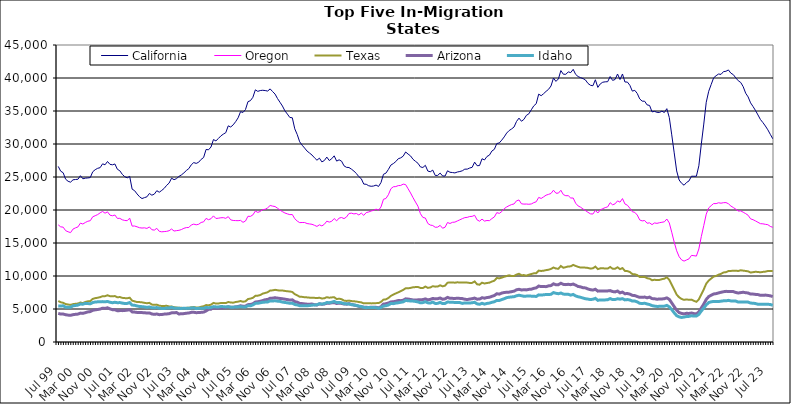
| Category |  California  |  Oregon  |  Texas  |  Arizona  |  Idaho  |
|---|---|---|---|---|---|
| Jul 99 | 26605 | 17749 | 6209 | 4339 | 5471 |
| Aug 99 | 25882 | 17447 | 6022 | 4228 | 5444 |
| Sep 99 | 25644 | 17401 | 5941 | 4237 | 5488 |
| Oct 99 | 24669 | 16875 | 5751 | 4134 | 5279 |
| Nov 99 | 24353 | 16701 | 5680 | 4073 | 5260 |
| Dec 99 | 24218 | 16570 | 5619 | 4042 | 5269 |
| Jan 00 | 24574 | 17109 | 5736 | 4142 | 5485 |
| Feb 00 | 24620 | 17295 | 5789 | 4192 | 5530 |
| Mar 00 | 24655 | 17436 | 5826 | 4226 | 5590 |
| Apr 00 | 25195 | 18009 | 5980 | 4375 | 5748 |
| May 00 | 24730 | 17875 | 5897 | 4337 | 5729 |
| Jun 00 | 24825 | 18113 | 6070 | 4444 | 5853 |
| Jul 00 | 24857 | 18294 | 6163 | 4555 | 5824 |
| Aug 00 | 24913 | 18376 | 6199 | 4603 | 5788 |
| Sep 00 | 25792 | 18971 | 6529 | 4804 | 5976 |
| Oct 00 | 26106 | 19135 | 6643 | 4870 | 6058 |
| Nov 00 | 26315 | 19306 | 6705 | 4926 | 6085 |
| Dec 00 | 26415 | 19570 | 6793 | 4991 | 6096 |
| Jan 01 | 26995 | 19781 | 6942 | 5122 | 6119 |
| Feb 01 | 26851 | 19519 | 6948 | 5089 | 6090 |
| Mar 01 | 27352 | 19720 | 7080 | 5180 | 6143 |
| Apr 01 | 26918 | 19221 | 6943 | 5020 | 6020 |
| May 01 | 26848 | 19126 | 6924 | 4899 | 5950 |
| Jun 01 | 26974 | 19241 | 6959 | 4895 | 6019 |
| Jul 01 | 26172 | 18725 | 6778 | 4737 | 5951 |
| Aug 01 | 25943 | 18736 | 6810 | 4757 | 5973 |
| Sep 01 | 25399 | 18514 | 6688 | 4753 | 5895 |
| Oct 01 | 25050 | 18415 | 6650 | 4780 | 5833 |
| Nov 01 | 24873 | 18381 | 6631 | 4826 | 5850 |
| Dec 01 | 25099 | 18765 | 6708 | 4898 | 5969 |
| Jan 02 | 23158 | 17561 | 6261 | 4560 | 5595 |
| Feb 02 | 22926 | 17573 | 6162 | 4531 | 5560 |
| Mar 02 | 22433 | 17452 | 6052 | 4481 | 5458 |
| Apr 02 | 22012 | 17314 | 6046 | 4458 | 5380 |
| May 02 | 21733 | 17267 | 6007 | 4452 | 5358 |
| Jun 02 | 21876 | 17298 | 5933 | 4444 | 5315 |
| Jul 02 | 21997 | 17209 | 5873 | 4383 | 5243 |
| Aug 02 | 22507 | 17436 | 5929 | 4407 | 5315 |
| Sep 02 | 22244 | 17010 | 5672 | 4248 | 5192 |
| Oct 02 | 22406 | 16952 | 5625 | 4191 | 5167 |
| Nov 02 | 22922 | 17223 | 5663 | 4242 | 5221 |
| Dec 02 | 22693 | 16770 | 5499 | 4142 | 5120 |
| Jan 03 | 22964 | 16694 | 5463 | 4166 | 5089 |
| Feb 03 | 23276 | 16727 | 5461 | 4226 | 5077 |
| Mar 03 | 23736 | 16766 | 5486 | 4251 | 5145 |
| Apr 03 | 24079 | 16859 | 5389 | 4289 | 5145 |
| May 03 | 24821 | 17117 | 5378 | 4415 | 5254 |
| Jun 03 | 24592 | 16812 | 5273 | 4426 | 5135 |
| Jul 03 | 24754 | 16875 | 5226 | 4466 | 5124 |
| Aug 03 | 25092 | 16922 | 5181 | 4244 | 5100 |
| Sep 03 | 25316 | 17036 | 5181 | 4279 | 5086 |
| Oct 03 | 25622 | 17228 | 5139 | 4301 | 5110 |
| Nov 03 | 25984 | 17335 | 5175 | 4362 | 5091 |
| Dec 03 | 26269 | 17350 | 5189 | 4396 | 5113 |
| Jan 04 | 26852 | 17734 | 5255 | 4492 | 5152 |
| Feb 04 | 27184 | 17860 | 5301 | 4502 | 5183 |
| Mar 04 | 27062 | 17757 | 5227 | 4443 | 5056 |
| Apr 04 | 27238 | 17840 | 5227 | 4461 | 5104 |
| May 04 | 27671 | 18113 | 5345 | 4493 | 5095 |
| Jun 04 | 27949 | 18201 | 5416 | 4532 | 5103 |
| Jul 04 | 29172 | 18727 | 5597 | 4697 | 5231 |
| Aug 04 | 29122 | 18529 | 5561 | 4945 | 5197 |
| Sep 04 | 29542 | 18678 | 5656 | 4976 | 5237 |
| Oct 04 | 30674 | 19108 | 5922 | 5188 | 5363 |
| Nov 04 | 30472 | 18716 | 5823 | 5106 | 5321 |
| Dec 04 | 30831 | 18755 | 5838 | 5135 | 5312 |
| Jan 05 | 31224 | 18823 | 5906 | 5155 | 5374 |
| Feb 05 | 31495 | 18842 | 5898 | 5168 | 5357 |
| Mar 05 | 31714 | 18738 | 5894 | 5212 | 5313 |
| Apr 05 | 32750 | 18998 | 6060 | 5340 | 5350 |
| May 05 | 32575 | 18504 | 5989 | 5269 | 5276 |
| Jun 05 | 32898 | 18414 | 5954 | 5252 | 5271 |
| Jul 05 | 33384 | 18395 | 6062 | 5322 | 5322 |
| Aug 05 | 33964 | 18381 | 6113 | 5375 | 5316 |
| Sep 05 | 34897 | 18426 | 6206 | 5493 | 5362 |
| Oct 05 | 34780 | 18132 | 6100 | 5408 | 5308 |
| Nov 05 | 35223 | 18332 | 6162 | 5434 | 5314 |
| Dec 05 | 36415 | 19047 | 6508 | 5658 | 5487 |
| Jan 06 | 36567 | 19032 | 6576 | 5688 | 5480 |
| Feb 06 | 37074 | 19257 | 6692 | 5792 | 5616 |
| Mar 06 | 38207 | 19845 | 6993 | 6052 | 5850 |
| Apr 06 | 37976 | 19637 | 7024 | 6101 | 5864 |
| May 06 | 38099 | 19781 | 7114 | 6178 | 5943 |
| Jun 06 | 38141 | 20061 | 7331 | 6276 | 6018 |
| Jul 06 | 38097 | 20111 | 7431 | 6399 | 6046 |
| Aug 06 | 38021 | 20333 | 7542 | 6450 | 6064 |
| Sep 06 | 38349 | 20686 | 7798 | 6627 | 6232 |
| Oct 06 | 37947 | 20591 | 7825 | 6647 | 6216 |
| Nov 06 | 37565 | 20526 | 7907 | 6707 | 6244 |
| Dec 06 | 36884 | 20272 | 7840 | 6648 | 6192 |
| Jan 07 | 36321 | 19984 | 7789 | 6597 | 6151 |
| Feb 07 | 35752 | 19752 | 7799 | 6554 | 6048 |
| Mar 07 | 35025 | 19547 | 7737 | 6487 | 5989 |
| Apr 07 | 34534 | 19412 | 7685 | 6430 | 5937 |
| May 07 | 34022 | 19296 | 7654 | 6353 | 5858 |
| Jun 07 | 33974 | 19318 | 7577 | 6390 | 5886 |
| Jul 07 | 32298 | 18677 | 7250 | 6117 | 5682 |
| Aug 07 | 31436 | 18322 | 7070 | 6034 | 5617 |
| Sep 07 | 30331 | 18087 | 6853 | 5847 | 5500 |
| Oct 07 | 29813 | 18108 | 6839 | 5821 | 5489 |
| Nov 07 | 29384 | 18105 | 6777 | 5769 | 5481 |
| Dec 07 | 28923 | 17949 | 6760 | 5733 | 5499 |
| Jan 08 | 28627 | 17890 | 6721 | 5732 | 5521 |
| Feb 08 | 28328 | 17834 | 6719 | 5749 | 5579 |
| Mar 08 | 27911 | 17680 | 6690 | 5650 | 5614 |
| Apr 08 | 27543 | 17512 | 6656 | 5612 | 5635 |
| May 08 | 27856 | 17754 | 6705 | 5774 | 5798 |
| Jun 08 | 27287 | 17589 | 6593 | 5717 | 5745 |
| Jul 08 | 27495 | 17834 | 6623 | 5761 | 5807 |
| Aug 08 | 28018 | 18309 | 6789 | 5867 | 5982 |
| Sep-08 | 27491 | 18164 | 6708 | 5864 | 5954 |
| Oct 08 | 27771 | 18291 | 6755 | 5942 | 6032 |
| Nov 08 | 28206 | 18706 | 6787 | 5970 | 6150 |
| Dec 08 | 27408 | 18353 | 6505 | 5832 | 5975 |
| Jan 09 | 27601 | 18778 | 6569 | 5890 | 5995 |
| Feb 09 | 27394 | 18863 | 6483 | 5845 | 5936 |
| Mar 09 | 26690 | 18694 | 6273 | 5751 | 5806 |
| Apr 09 | 26461 | 18943 | 6222 | 5735 | 5777 |
| May 09 | 26435 | 19470 | 6272 | 5819 | 5767 |
| Jun 09 | 26187 | 19522 | 6199 | 5700 | 5649 |
| Jul 09 | 25906 | 19408 | 6171 | 5603 | 5617 |
| Aug 09 | 25525 | 19469 | 6128 | 5533 | 5540 |
| Sep 09 | 25050 | 19249 | 6059 | 5405 | 5437 |
| Oct 09 | 24741 | 19529 | 6004 | 5349 | 5369 |
| Nov 09 | 23928 | 19187 | 5854 | 5271 | 5248 |
| Dec 09 | 23899 | 19607 | 5886 | 5261 | 5195 |
| Jan 10 | 23676 | 19703 | 5881 | 5232 | 5234 |
| Feb 10 | 23592 | 19845 | 5850 | 5272 | 5236 |
| Mar 10 | 23634 | 19946 | 5864 | 5278 | 5219 |
| Apr 10 | 23774 | 20134 | 5889 | 5257 | 5201 |
| May 10 | 23567 | 19966 | 5897 | 5172 | 5105 |
| Jun 10 | 24166 | 20464 | 6087 | 5356 | 5237 |
| Jul 10 | 25410 | 21627 | 6417 | 5742 | 5452 |
| Aug 10 | 25586 | 21744 | 6465 | 5797 | 5491 |
| Sep 10 | 26150 | 22314 | 6667 | 5907 | 5609 |
| Oct 10 | 26807 | 23219 | 6986 | 6070 | 5831 |
| Nov 10 | 27033 | 23520 | 7179 | 6100 | 5810 |
| Dec 10 | 27332 | 23551 | 7361 | 6182 | 5898 |
| Jan 11 | 27769 | 23697 | 7525 | 6276 | 5938 |
| Feb 11 | 27898 | 23718 | 7708 | 6267 | 6016 |
| Mar 11 | 28155 | 23921 | 7890 | 6330 | 6081 |
| Apr 11 | 28790 | 23847 | 8146 | 6544 | 6305 |
| May 11 | 28471 | 23215 | 8131 | 6502 | 6248 |
| Jun 11 | 28191 | 22580 | 8199 | 6445 | 6217 |
| Jul 11 | 27678 | 21867 | 8291 | 6368 | 6202 |
| Aug 11 | 27372 | 21203 | 8321 | 6356 | 6146 |
| Sep 11 | 27082 | 20570 | 8341 | 6387 | 6075 |
| Oct 11 | 26528 | 19442 | 8191 | 6402 | 5932 |
| Nov 11 | 26440 | 18872 | 8176 | 6426 | 5968 |
| Dec 11 | 26770 | 18784 | 8401 | 6533 | 6106 |
| Jan 12 | 25901 | 17963 | 8202 | 6390 | 5933 |
| Feb 12 | 25796 | 17718 | 8266 | 6456 | 5900 |
| Mar 12 | 26042 | 17647 | 8456 | 6600 | 6054 |
| Apr 12 | 25239 | 17386 | 8388 | 6534 | 5838 |
| May 12 | 25238 | 17407 | 8401 | 6558 | 5854 |
| Jun 12 | 25593 | 17673 | 8594 | 6669 | 6009 |
| Jul 12 | 25155 | 17237 | 8432 | 6474 | 5817 |
| Aug 12 | 25146 | 17391 | 8536 | 6539 | 5842 |
| Sep 12 | 25942 | 18102 | 8989 | 6759 | 6061 |
| Oct 12 | 25718 | 17953 | 9012 | 6618 | 6027 |
| Nov 12 | 25677 | 18134 | 9032 | 6611 | 6009 |
| Dec 12 | 25619 | 18166 | 8981 | 6601 | 5999 |
| Jan 13 | 25757 | 18344 | 9051 | 6627 | 5989 |
| Feb-13 | 25830 | 18512 | 9001 | 6606 | 5968 |
| Mar-13 | 25940 | 18689 | 9021 | 6577 | 5853 |
| Apr 13 | 26187 | 18844 | 9013 | 6478 | 5925 |
| May 13 | 26192 | 18884 | 9003 | 6431 | 5924 |
| Jun-13 | 26362 | 19013 | 8948 | 6508 | 5896 |
| Jul 13 | 26467 | 19037 | 8958 | 6559 | 5948 |
| Aug 13 | 27253 | 19198 | 9174 | 6655 | 6020 |
| Sep 13 | 26711 | 18501 | 8747 | 6489 | 5775 |
| Oct 13 | 26733 | 18301 | 8681 | 6511 | 5711 |
| Nov 13 | 27767 | 18620 | 8989 | 6709 | 5860 |
| Dec 13 | 27583 | 18320 | 8863 | 6637 | 5740 |
| Jan 14 | 28107 | 18409 | 8939 | 6735 | 5843 |
| Feb-14 | 28313 | 18383 | 8989 | 6779 | 5893 |
| Mar 14 | 28934 | 18696 | 9160 | 6918 | 6015 |
| Apr 14 | 29192 | 18946 | 9291 | 7036 | 6099 |
| May 14 | 30069 | 19603 | 9701 | 7314 | 6304 |
| Jun 14 | 30163 | 19487 | 9641 | 7252 | 6293 |
| Jul-14 | 30587 | 19754 | 9752 | 7415 | 6427 |
| Aug-14 | 31074 | 20201 | 9882 | 7499 | 6557 |
| Sep 14 | 31656 | 20459 | 9997 | 7536 | 6719 |
| Oct 14 | 32037 | 20663 | 10109 | 7555 | 6786 |
| Nov 14 | 32278 | 20825 | 9992 | 7628 | 6831 |
| Dec 14 | 32578 | 20918 | 10006 | 7705 | 6860 |
| Jan 15 | 33414 | 21396 | 10213 | 7906 | 7000 |
| Feb 15 | 33922 | 21518 | 10337 | 7982 | 7083 |
| Mar 15 | 33447 | 20942 | 10122 | 7891 | 7006 |
| Apr-15 | 33731 | 20893 | 10138 | 7906 | 6931 |
| May 15 | 34343 | 20902 | 10053 | 7895 | 6952 |
| Jun-15 | 34572 | 20870 | 10192 | 7973 | 6966 |
| Jul 15 | 35185 | 20916 | 10303 | 8000 | 6949 |
| Aug 15 | 35780 | 21115 | 10399 | 8126 | 6938 |
| Sep 15 | 36109 | 21246 | 10428 | 8207 | 6896 |
| Oct 15 | 37555 | 21908 | 10813 | 8477 | 7140 |
| Nov 15 | 37319 | 21750 | 10763 | 8390 | 7112 |
| Dec 15 | 37624 | 21990 | 10807 | 8395 | 7149 |
| Jan 16 | 37978 | 22248 | 10892 | 8388 | 7201 |
| Feb 16 | 38285 | 22369 | 10951 | 8508 | 7192 |
| Mar 16 | 38792 | 22506 | 11075 | 8547 | 7226 |
| Apr 16 | 39994 | 22999 | 11286 | 8815 | 7487 |
| May 16 | 39488 | 22548 | 11132 | 8673 | 7382 |
| Jun 16 | 39864 | 22556 | 11100 | 8682 | 7315 |
| Jul 16 | 41123 | 22989 | 11516 | 8903 | 7420 |
| Aug 16 | 40573 | 22333 | 11251 | 8731 | 7261 |
| Sep 16 | 40560 | 22162 | 11340 | 8692 | 7216 |
| Oct 16 | 40923 | 22172 | 11456 | 8742 | 7233 |
| Nov 16 | 40817 | 21818 | 11459 | 8685 | 7101 |
| Dec 16 | 41311 | 21815 | 11681 | 8783 | 7203 |
| Jan 17 | 40543 | 21029 | 11524 | 8609 | 6982 |
| Feb 17 | 40218 | 20613 | 11385 | 8416 | 6852 |
| Mar 17 | 40052 | 20425 | 11276 | 8354 | 6775 |
| Apr 17 | 39913 | 20147 | 11297 | 8218 | 6653 |
| May 17 | 39695 | 19910 | 11265 | 8196 | 6552 |
| Jun 17 | 39177 | 19650 | 11225 | 8034 | 6500 |
| Jul 17 | 38901 | 19419 | 11115 | 7923 | 6429 |
| Aug 17 | 38827 | 19389 | 11168 | 7867 | 6479 |
| Sep 17 | 39736 | 19936 | 11426 | 7991 | 6609 |
| Oct 17 | 38576 | 19547 | 11041 | 7708 | 6315 |
| Nov 17 | 39108 | 20013 | 11158 | 7746 | 6381 |
| Dec 17 | 39359 | 20202 | 11185 | 7743 | 6366 |
| Jan 18 | 39420 | 20362 | 11118 | 7736 | 6380 |
| Feb 18 | 39440 | 20476 | 11128 | 7741 | 6407 |
| Mar 18 | 40218 | 21106 | 11362 | 7789 | 6578 |
| Apr 18 | 39637 | 20788 | 11111 | 7642 | 6423 |
| May 18 | 39777 | 20933 | 11097 | 7591 | 6430 |
| Jun 18 | 40602 | 21381 | 11317 | 7721 | 6554 |
| Jul 18 | 39767 | 21189 | 11038 | 7445 | 6489 |
| Aug 18 | 40608 | 21729 | 11200 | 7560 | 6569 |
| Sep 18 | 39395 | 20916 | 10772 | 7318 | 6383 |
| Oct 18 | 39383 | 20724 | 10740 | 7344 | 6429 |
| Nov 18 | 38891 | 20265 | 10605 | 7255 | 6365 |
| Dec 18 | 38013 | 19741 | 10292 | 7069 | 6205 |
| Jan 19 | 38130 | 19643 | 10261 | 7032 | 6203 |
| Feb 19 | 37658 | 19237 | 10132 | 6892 | 6073 |
| Mar 19 | 36831 | 18492 | 9848 | 6766 | 5863 |
| Apr 19 | 36492 | 18349 | 9839 | 6763 | 5827 |
| May 19 | 36481 | 18407 | 9867 | 6809 | 5873 |
| Jun 19 | 35925 | 17998 | 9661 | 6698 | 5761 |
| Jul 19 | 35843 | 18049 | 9598 | 6800 | 5673 |
| Aug 19 | 34870 | 17785 | 9361 | 6577 | 5512 |
| Sep 19 | 34945 | 18038 | 9428 | 6547 | 5437 |
| Oct 19 | 34802 | 17977 | 9385 | 6483 | 5390 |
| Nov 19 | 34775 | 18072 | 9403 | 6511 | 5401 |
| Dec 19 | 34976 | 18140 | 9518 | 6521 | 5419 |
| Jan 20 | 34774 | 18209 | 9594 | 6561 | 5434 |
| Feb 20 | 35352 | 18632 | 9804 | 6682 | 5543 |
| Mar 20 | 34013 | 18041 | 9411 | 6464 | 5330 |
| Apr 20 | 31385 | 16629 | 8666 | 5922 | 4906 |
| May 20 | 28657 | 15123 | 7927 | 5355 | 4419 |
| Jun 20 | 25915 | 13817 | 7164 | 4815 | 3992 |
| Jul 20 | 24545 | 12926 | 6776 | 4457 | 3810 |
| Aug 20 | 24048 | 12443 | 6521 | 4326 | 3720 |
| Sep 20 | 23756 | 12258 | 6386 | 4266 | 3784 |
| Oct 20 | 24166 | 12429 | 6452 | 4347 | 3861 |
| Nov 20 | 24404 | 12597 | 6386 | 4324 | 3883 |
| Dec 20 | 25120 | 13122 | 6420 | 4394 | 3974 |
| Jan 21 | 25111 | 13080 | 6236 | 4304 | 3924 |
| Feb 21 | 25114 | 13015 | 6094 | 4260 | 3930 |
| Mar 21 | 26701 | 14096 | 6455 | 4567 | 4185 |
| Apr 21 | 29998 | 15978 | 7222 | 5164 | 4697 |
| May 21 | 33020 | 17641 | 7969 | 5748 | 5148 |
| Jun 21 | 36320 | 19369 | 8840 | 6450 | 5628 |
| Jul 21 | 37989 | 20320 | 9306 | 6877 | 5984 |
| Aug 21 | 39007 | 20657 | 9615 | 7094 | 6084 |
| Sep 21 | 40023 | 20974 | 9914 | 7277 | 6151 |
| Oct 21 | 40348 | 20966 | 10003 | 7327 | 6140 |
| Nov 21 | 40599 | 21096 | 10203 | 7437 | 6136 |
| Dec 21 | 40548 | 21032 | 10328 | 7532 | 6183 |
| Jan 22 | 40967 | 21106 | 10535 | 7618 | 6237 |
| Feb 22 | 41019 | 21125 | 10579 | 7673 | 6236 |
| Mar 22 | 41220 | 20949 | 10751 | 7660 | 6310 |
| Apr 22 | 40730 | 20602 | 10772 | 7661 | 6221 |
| May 22 | 40504 | 20370 | 10792 | 7636 | 6210 |
| Jun 22 | 40013 | 20127 | 10802 | 7504 | 6199 |
| Jul 22 | 39582 | 19846 | 10761 | 7419 | 6050 |
| Aug 22 | 39321 | 19865 | 10868 | 7487 | 6071 |
| Sep 22 | 38685 | 19666 | 10811 | 7536 | 6074 |
| Oct 22 | 37700 | 19450 | 10764 | 7469 | 6042 |
| Nov 22 | 37133 | 19198 | 10701 | 7425 | 6042 |
| Dec 22 | 36232 | 18659 | 10527 | 7261 | 5898 |
| Jan 23 | 35674 | 18528 | 10578 | 7263 | 5879 |
| Feb 23 | 35072 | 18344 | 10642 | 7211 | 5827 |
| Mar 23 | 34396 | 18133 | 10609 | 7183 | 5713 |
| Apr 23 | 33708 | 17931 | 10559 | 7074 | 5706 |
| May 23 | 33245 | 17904 | 10624 | 7091 | 5712 |
| Jun 23 | 32727 | 17831 | 10663 | 7105 | 5726 |
| Jul 23 | 32148 | 17773 | 10760 | 7058 | 5719 |
| Aug 23 | 31461 | 17513 | 10759 | 6999 | 5681 |
| Sep 23 | 30794 | 17376 | 10754 | 6882 | 5566 |